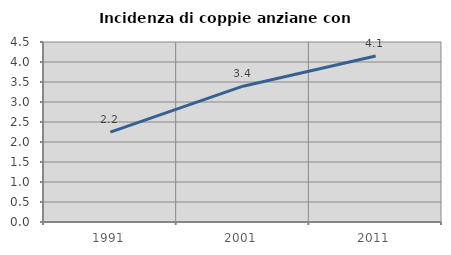
| Category | Incidenza di coppie anziane con figli |
|---|---|
| 1991.0 | 2.249 |
| 2001.0 | 3.396 |
| 2011.0 | 4.149 |